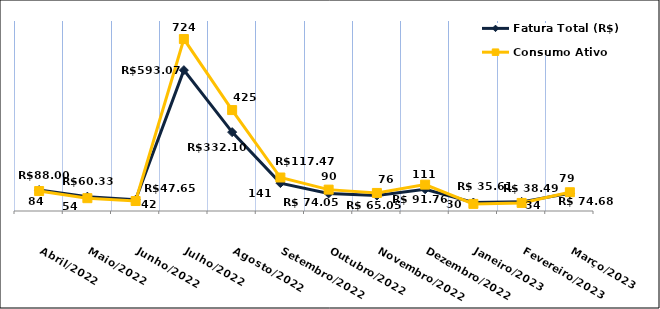
| Category | Fatura Total (R$) |
|---|---|
| Abril/2022 | 88 |
| Maio/2022 | 60.33 |
| Junho/2022 | 47.65 |
| Julho/2022 | 593.07 |
| Agosto/2022 | 332.1 |
| Setembro/2022 | 117.47 |
| Outubro/2022 | 74.05 |
| Novembro/2022 | 65.05 |
| Dezembro/2022 | 91.76 |
| Janeiro/2023 | 35.61 |
| Fevereiro/2023 | 38.49 |
| Março/2023 | 74.68 |